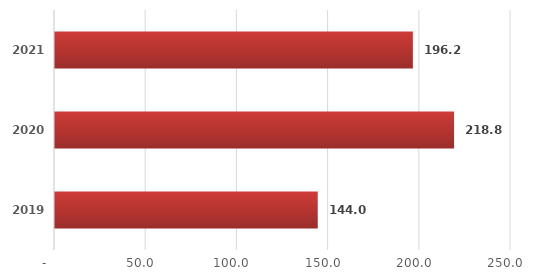
| Category | Series 0 |
|---|---|
| 2019.0 | 144.047 |
| 2020.0 | 218.8 |
| 2021.0 | 196.2 |